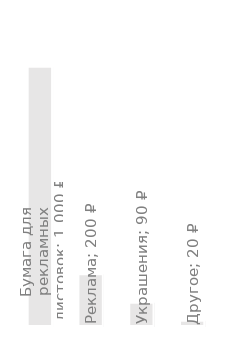
| Category | Годовые расходы |
|---|---|
| Бумага для рекламных листовок | 1000 |
| Реклама | 200 |
| Украшения | 90 |
| Другое | 20 |